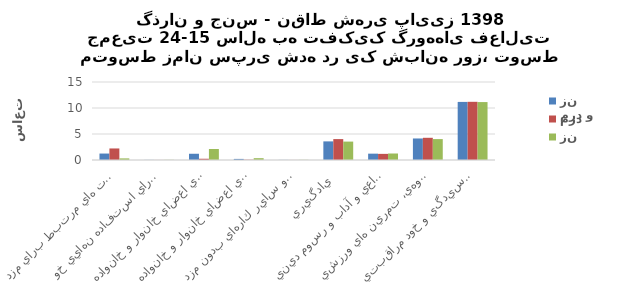
| Category | مرد و زن | مرد | زن |
|---|---|---|---|
| اشتغال و فعاليت هاي مرتبط براي مزد  | 1.24 | 2.22 | 0.31 |
| توليد كالا براي استفاده نهايي خود   | 0.02 | 0.01 | 0.03 |
| خدمات خانگي بدون مزد براي اعضاي خانوار و خانواده   | 1.2 | 0.24 | 2.12 |
| خدمات مراقبتي بدون مزد براي اعضاي خانوار و خانواده   | 0.21 | 0.06 | 0.35 |
| كارداوطلبانه بدون مزد، كار آموزي و ساير كارهاي بدون مزد  | 0.02 | 0.01 | 0.03 |
| يادگيري  | 3.58 | 4.02 | 3.54 |
| معاشرت، ارتباط، مشاركت اجتماعي و آداب و رسوم ديني  | 1.22 | 1.18 | 1.25 |
| فرهنگ، فراغت، رسانه هاي گروهي، تمرين هاي ورزشي  | 4.14 | 4.27 | 4.02 |
| رسيدگي و خود مراقبتي   | 11.17 | 11.19 | 11.14 |